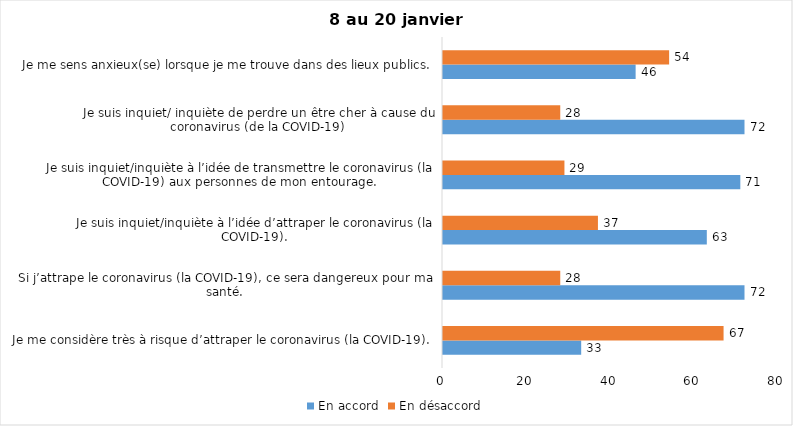
| Category | En accord | En désaccord |
|---|---|---|
| Je me considère très à risque d’attraper le coronavirus (la COVID-19). | 33 | 67 |
| Si j’attrape le coronavirus (la COVID-19), ce sera dangereux pour ma santé. | 72 | 28 |
| Je suis inquiet/inquiète à l’idée d’attraper le coronavirus (la COVID-19). | 63 | 37 |
| Je suis inquiet/inquiète à l’idée de transmettre le coronavirus (la COVID-19) aux personnes de mon entourage. | 71 | 29 |
| Je suis inquiet/ inquiète de perdre un être cher à cause du coronavirus (de la COVID-19) | 72 | 28 |
| Je me sens anxieux(se) lorsque je me trouve dans des lieux publics. | 46 | 54 |